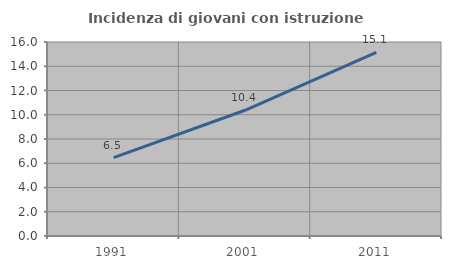
| Category | Incidenza di giovani con istruzione universitaria |
|---|---|
| 1991.0 | 6.461 |
| 2001.0 | 10.369 |
| 2011.0 | 15.143 |